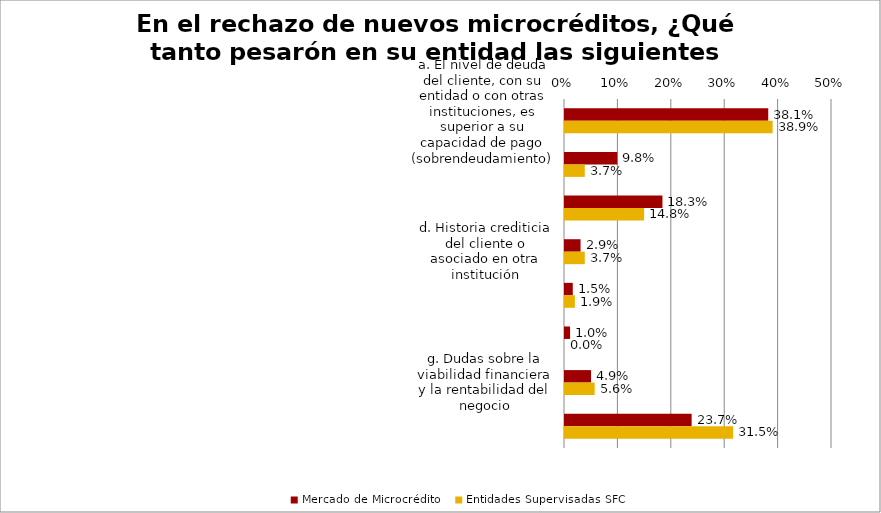
| Category | Mercado de Microcrédito | Entidades Supervisadas SFC |
|---|---|---|
| a. El nivel de deuda del cliente, con su entidad o con otras instituciones, es superior a su capacidad de pago (sobrendeudamiento) | 0.381 | 0.389 |
| b. Crédito con más de tres entidades | 0.098 | 0.037 |
| c. Mala historia crediticia | 0.183 | 0.148 |
| d. Historia crediticia del cliente o asociado en otra institución | 0.029 | 0.037 |
| e. Poco tiempo de creada la microempresa | 0.015 | 0.019 |
| f. Por sector productivo al cual pertenece el aplicante de crédito o del cual deriva sus principales fuentes de ingreso | 0.01 | 0 |
| g. Dudas sobre la viabilidad financiera y la rentabilidad del negocio | 0.049 | 0.056 |
| h. Capacidad de pago del cliente | 0.237 | 0.315 |